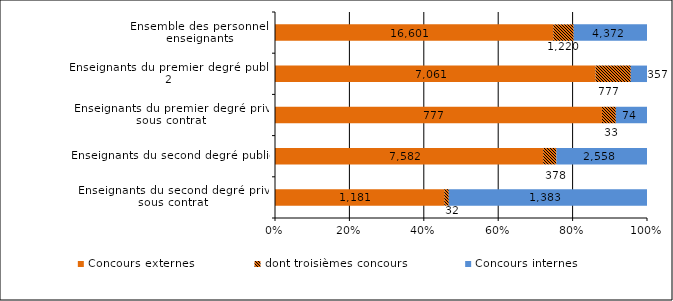
| Category | Concours externes | dont troisièmes concours | Concours internes |
|---|---|---|---|
| Enseignants du second degré privé sous contrat  | 1181 | 32 | 1383 |
| Enseignants du second degré public | 7582 | 378 | 2558 |
| Enseignants du premier degré privé sous contrat  | 777 | 33 | 74 |
| Enseignants du premier degré public 2 | 7061 | 777 | 357 |
| Ensemble des personnels enseignants | 16601 | 1220 | 4372 |